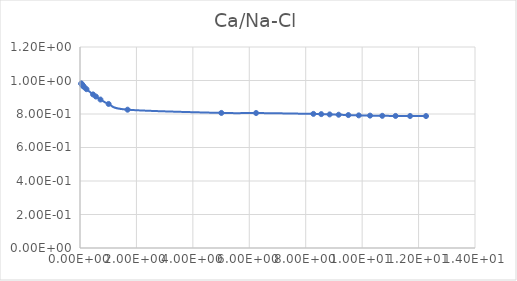
| Category | Series 0 |
|---|---|
| 0.045798 | 0.982 |
| 0.050886 | 0.981 |
| 0.057258 | 0.979 |
| 0.065456 | 0.977 |
| 0.076369 | 0.974 |
| 0.091683 | 0.971 |
| 0.11463 | 0.967 |
| 0.15298 | 0.96 |
| 0.2297 | 0.948 |
| 0.46159 | 0.917 |
| 0.56399 | 0.904 |
| 0.72477 | 0.886 |
| 1.0138 | 0.86 |
| 1.6863 | 0.826 |
| 5.0106 | 0.806 |
| 6.241 | 0.806 |
| 8.2722 | 0.801 |
| 8.5505 | 0.799 |
| 8.8482 | 0.798 |
| 9.1674 | 0.796 |
| 9.5104 | 0.794 |
| 9.8801 | 0.792 |
| 10.28 | 0.79 |
| 10.713 | 0.789 |
| 11.185 | 0.788 |
| 11.699 | 0.788 |
| 12.264 | 0.788 |